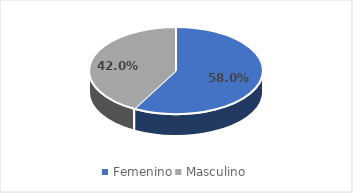
| Category | SEXO DE SOLICITANTES |
|---|---|
| Femenino | 0.58 |
| Masculino | 0.42 |